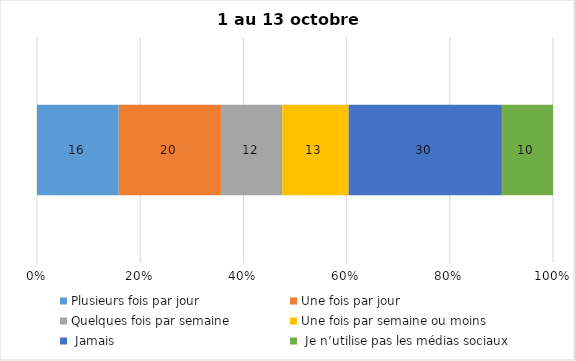
| Category | Plusieurs fois par jour | Une fois par jour | Quelques fois par semaine   | Une fois par semaine ou moins   |  Jamais   |  Je n’utilise pas les médias sociaux |
|---|---|---|---|---|---|---|
| 0 | 16 | 20 | 12 | 13 | 30 | 10 |